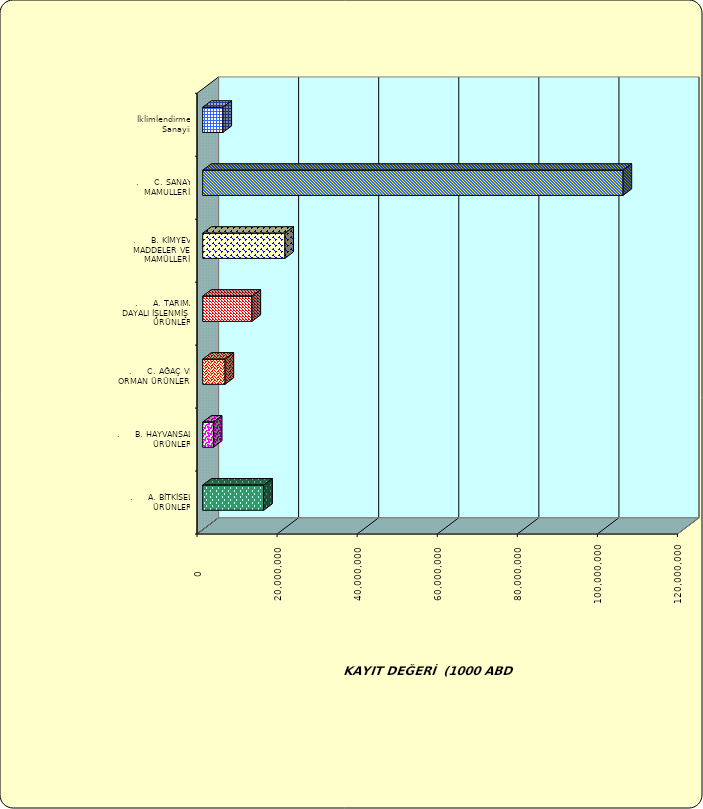
| Category | Series 0 |
|---|---|
| .     A. BİTKİSEL ÜRÜNLER | 15252996.318 |
| .     B. HAYVANSAL ÜRÜNLER | 2671342.296 |
| .     C. AĞAÇ VE ORMAN ÜRÜNLERİ | 5587267.845 |
| .     A. TARIMA DAYALI İŞLENMİŞ ÜRÜNLER | 12321586.266 |
| .     B. KİMYEVİ MADDELER VE MAMÜLLERİ | 20535462.874 |
| .     C. SANAYİ MAMULLERİ | 104998601.002 |
|  İklimlendirme Sanayii | 5065214.206 |